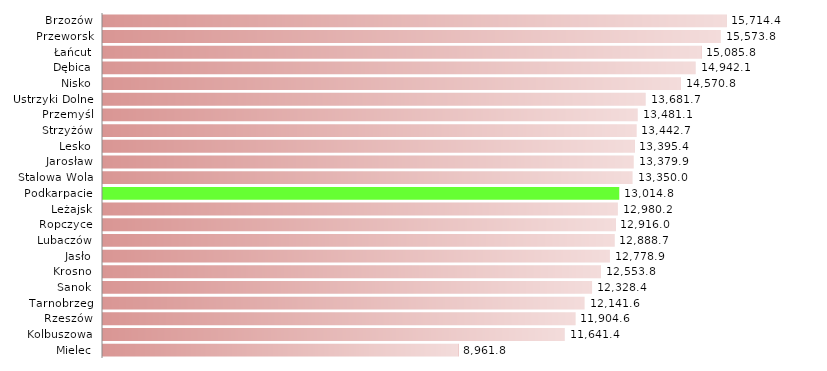
| Category | Staże |
|---|---|
| Mielec | 8961.803 |
| Kolbuszowa | 11641.39 |
| Rzeszów | 11904.609 |
| Tarnobrzeg | 12141.553 |
| Sanok | 12328.42 |
| Krosno | 12553.818 |
| Jasło | 12778.87 |
| Lubaczów | 12888.656 |
| Ropczyce | 12915.992 |
| Leżajsk | 12980.239 |
| Podkarpacie | 13014.846 |
| Stalowa Wola | 13350.01 |
| Jarosław | 13379.879 |
| Lesko | 13395.393 |
| Strzyżów | 13442.706 |
| Przemyśl | 13481.053 |
| Ustrzyki Dolne | 13681.67 |
| Nisko | 14570.844 |
| Dębica | 14942.121 |
| Łańcut | 15085.838 |
| Przeworsk | 15573.837 |
| Brzozów | 15714.401 |